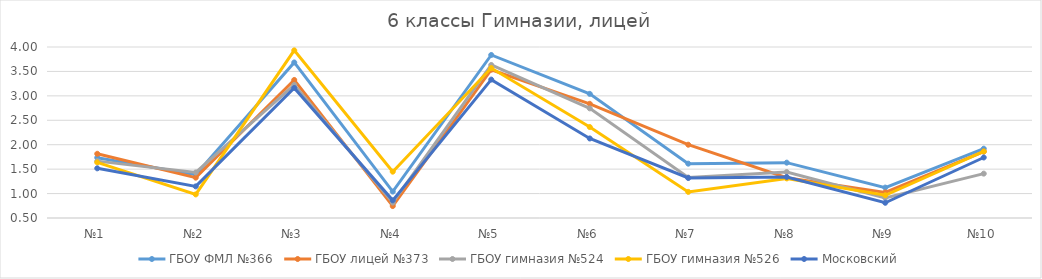
| Category | ГБОУ ФМЛ №366 | ГБОУ лицей №373 | ГБОУ гимназия №524 | ГБОУ гимназия №526 | Московский |
|---|---|---|---|---|---|
| №1 | 1.735 | 1.814 | 1.664 | 1.638 | 1.517 |
| №2 | 1.388 | 1.326 | 1.432 | 0.983 | 1.147 |
| №3 | 3.684 | 3.326 | 3.224 | 3.931 | 3.162 |
| №4 | 1.041 | 0.744 | 0.816 | 1.448 | 0.862 |
| №5 | 3.837 | 3.535 | 3.632 | 3.569 | 3.333 |
| №6 | 3.041 | 2.837 | 2.744 | 2.362 | 2.128 |
| №7 | 1.612 | 2 | 1.328 | 1.034 | 1.319 |
| №8 | 1.633 | 1.326 | 1.44 | 1.31 | 1.339 |
| №9 | 1.122 | 1.023 | 0.912 | 0.966 | 0.812 |
| №10 | 1.918 | 1.86 | 1.408 | 1.862 | 1.738 |